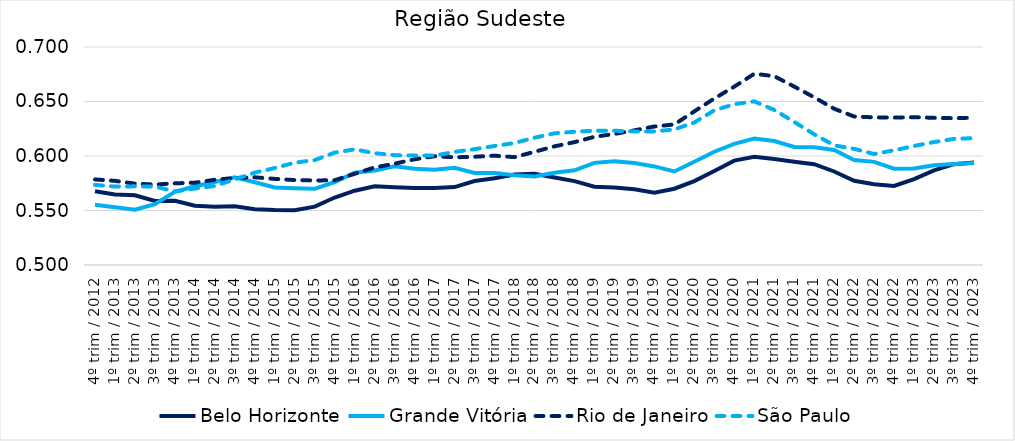
| Category | Belo Horizonte | Grande Vitória | Rio de Janeiro | São Paulo |
|---|---|---|---|---|
| 4º trim / 2012 | 0.568 | 0.555 | 0.579 | 0.573 |
| 1º trim / 2013 | 0.565 | 0.553 | 0.577 | 0.572 |
| 2º trim / 2013 | 0.564 | 0.551 | 0.575 | 0.572 |
| 3º trim / 2013 | 0.559 | 0.556 | 0.574 | 0.572 |
| 4º trim / 2013 | 0.559 | 0.567 | 0.575 | 0.567 |
| 1º trim / 2014 | 0.554 | 0.572 | 0.576 | 0.57 |
| 2º trim / 2014 | 0.554 | 0.576 | 0.578 | 0.573 |
| 3º trim / 2014 | 0.554 | 0.58 | 0.58 | 0.579 |
| 4º trim / 2014 | 0.551 | 0.576 | 0.58 | 0.585 |
| 1º trim / 2015 | 0.55 | 0.571 | 0.579 | 0.589 |
| 2º trim / 2015 | 0.55 | 0.57 | 0.578 | 0.594 |
| 3º trim / 2015 | 0.554 | 0.57 | 0.578 | 0.596 |
| 4º trim / 2015 | 0.562 | 0.576 | 0.578 | 0.603 |
| 1º trim / 2016 | 0.568 | 0.585 | 0.584 | 0.606 |
| 2º trim / 2016 | 0.572 | 0.587 | 0.59 | 0.603 |
| 3º trim / 2016 | 0.571 | 0.591 | 0.593 | 0.601 |
| 4º trim / 2016 | 0.571 | 0.588 | 0.597 | 0.6 |
| 1º trim / 2017 | 0.571 | 0.587 | 0.6 | 0.6 |
| 2º trim / 2017 | 0.571 | 0.589 | 0.599 | 0.604 |
| 3º trim / 2017 | 0.577 | 0.584 | 0.599 | 0.606 |
| 4º trim / 2017 | 0.58 | 0.584 | 0.6 | 0.609 |
| 1º trim / 2018 | 0.583 | 0.582 | 0.599 | 0.612 |
| 2º trim / 2018 | 0.584 | 0.581 | 0.604 | 0.617 |
| 3º trim / 2018 | 0.58 | 0.585 | 0.609 | 0.621 |
| 4º trim / 2018 | 0.577 | 0.587 | 0.613 | 0.622 |
| 1º trim / 2019 | 0.572 | 0.594 | 0.618 | 0.623 |
| 2º trim / 2019 | 0.571 | 0.595 | 0.62 | 0.623 |
| 3º trim / 2019 | 0.57 | 0.594 | 0.624 | 0.623 |
| 4º trim / 2019 | 0.566 | 0.59 | 0.627 | 0.623 |
| 1º trim / 2020 | 0.57 | 0.586 | 0.629 | 0.624 |
| 2º trim / 2020 | 0.577 | 0.595 | 0.641 | 0.631 |
| 3º trim / 2020 | 0.586 | 0.604 | 0.653 | 0.642 |
| 4º trim / 2020 | 0.596 | 0.611 | 0.664 | 0.648 |
| 1º trim / 2021 | 0.599 | 0.616 | 0.675 | 0.65 |
| 2º trim / 2021 | 0.597 | 0.614 | 0.673 | 0.642 |
| 3º trim / 2021 | 0.595 | 0.608 | 0.664 | 0.631 |
| 4º trim / 2021 | 0.592 | 0.608 | 0.654 | 0.62 |
| 1º trim / 2022 | 0.586 | 0.606 | 0.643 | 0.61 |
| 2º trim / 2022 | 0.577 | 0.596 | 0.636 | 0.607 |
| 3º trim / 2022 | 0.574 | 0.595 | 0.635 | 0.602 |
| 4º trim / 2022 | 0.573 | 0.588 | 0.635 | 0.605 |
| 1º trim / 2023 | 0.579 | 0.588 | 0.636 | 0.609 |
| 2º trim / 2023 | 0.587 | 0.592 | 0.635 | 0.613 |
| 3º trim / 2023 | 0.592 | 0.593 | 0.635 | 0.616 |
| 4º trim / 2023 | 0.594 | 0.594 | 0.635 | 0.616 |